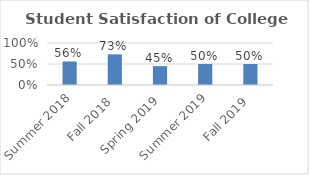
| Category | Series 0 |
|---|---|
| Summer 2018 | 0.56 |
| Fall 2018 | 0.73 |
| Spring 2019 | 0.45 |
| Summer 2019 | 0.5 |
| Fall 2019 | 0.5 |